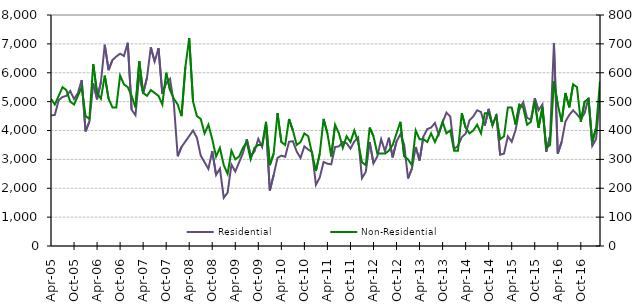
| Category | Residential |
|---|---|
| 2005-04-01 | 4520 |
| 2005-05-01 | 4540 |
| 2005-06-01 | 5050 |
| 2005-07-01 | 5160 |
| 2005-08-01 | 5200 |
| 2005-09-01 | 5370 |
| 2005-10-01 | 5090 |
| 2005-11-01 | 5290 |
| 2005-12-01 | 5750 |
| 2006-01-01 | 3970 |
| 2006-02-01 | 4310 |
| 2006-03-01 | 5630 |
| 2006-04-01 | 5080 |
| 2006-05-01 | 5680 |
| 2006-06-01 | 6970 |
| 2006-07-01 | 6090 |
| 2006-08-01 | 6440 |
| 2006-09-01 | 6560 |
| 2006-10-01 | 6660 |
| 2006-11-01 | 6580 |
| 2006-12-01 | 7040 |
| 2007-01-01 | 4720 |
| 2007-02-01 | 4530 |
| 2007-03-01 | 5940 |
| 2007-04-01 | 5280 |
| 2007-05-01 | 5830 |
| 2007-06-01 | 6880 |
| 2007-07-01 | 6390 |
| 2007-08-01 | 6850 |
| 2007-09-01 | 5270 |
| 2007-10-01 | 5660 |
| 2007-11-01 | 5790 |
| 2007-12-01 | 4940 |
| 2008-01-01 | 3110 |
| 2008-02-01 | 3430 |
| 2008-03-01 | 3620 |
| 2008-04-01 | 3810 |
| 2008-05-01 | 4000 |
| 2008-06-01 | 3750 |
| 2008-07-01 | 3130 |
| 2008-08-01 | 2900 |
| 2008-09-01 | 2670 |
| 2008-10-01 | 3290 |
| 2008-11-01 | 2460 |
| 2008-12-01 | 2680 |
| 2009-01-01 | 1670 |
| 2009-02-01 | 1850 |
| 2009-03-01 | 2820 |
| 2009-04-01 | 2580 |
| 2009-05-01 | 2900 |
| 2009-06-01 | 3220 |
| 2009-07-01 | 3700 |
| 2009-08-01 | 3130 |
| 2009-09-01 | 3270 |
| 2009-10-01 | 3710 |
| 2009-11-01 | 3430 |
| 2009-12-01 | 4210 |
| 2010-01-01 | 1920 |
| 2010-02-01 | 2460 |
| 2010-03-01 | 3050 |
| 2010-04-01 | 3130 |
| 2010-05-01 | 3090 |
| 2010-06-01 | 3610 |
| 2010-07-01 | 3630 |
| 2010-08-01 | 3270 |
| 2010-09-01 | 3050 |
| 2010-10-01 | 3450 |
| 2010-11-01 | 3340 |
| 2010-12-01 | 3260 |
| 2011-01-01 | 2120 |
| 2011-02-01 | 2370 |
| 2011-03-01 | 2910 |
| 2011-04-01 | 2850 |
| 2011-05-01 | 2830 |
| 2011-06-01 | 3430 |
| 2011-07-01 | 3450 |
| 2011-08-01 | 3600 |
| 2011-09-01 | 3560 |
| 2011-10-01 | 3370 |
| 2011-11-01 | 3620 |
| 2011-12-01 | 3760 |
| 2012-01-01 | 2350 |
| 2012-02-01 | 2570 |
| 2012-03-01 | 3600 |
| 2012-04-01 | 2860 |
| 2012-05-01 | 3100 |
| 2012-06-01 | 3700 |
| 2012-07-01 | 3280 |
| 2012-08-01 | 3750 |
| 2012-09-01 | 3070 |
| 2012-10-01 | 3620 |
| 2012-11-01 | 3870 |
| 2012-12-01 | 3510 |
| 2013-01-01 | 2340 |
| 2013-02-01 | 2680 |
| 2013-03-01 | 3430 |
| 2013-04-01 | 2960 |
| 2013-05-01 | 3790 |
| 2013-06-01 | 4050 |
| 2013-07-01 | 4100 |
| 2013-08-01 | 4260 |
| 2013-09-01 | 3860 |
| 2013-10-01 | 4280 |
| 2013-11-01 | 4620 |
| 2013-12-01 | 4480 |
| 2014-01-01 | 3350 |
| 2014-02-01 | 3470 |
| 2014-03-01 | 3770 |
| 2014-04-01 | 3890 |
| 2014-05-01 | 4350 |
| 2014-06-01 | 4490 |
| 2014-07-01 | 4700 |
| 2014-08-01 | 4640 |
| 2014-09-01 | 4170 |
| 2014-10-01 | 4750 |
| 2014-11-01 | 4170 |
| 2014-12-01 | 4560 |
| 2015-01-01 | 3160 |
| 2015-02-01 | 3200 |
| 2015-03-01 | 3800 |
| 2015-04-01 | 3610 |
| 2015-05-01 | 4010 |
| 2015-06-01 | 4720 |
| 2015-07-01 | 4980 |
| 2015-08-01 | 4440 |
| 2015-09-01 | 4370 |
| 2015-10-01 | 5120 |
| 2015-11-01 | 4700 |
| 2015-12-01 | 4900 |
| 2016-01-01 | 3260 |
| 2016-02-01 | 3810 |
| 2016-03-01 | 7020 |
| 2016-04-01 | 3200 |
| 2016-05-01 | 3600 |
| 2016-06-01 | 4310 |
| 2016-07-01 | 4540 |
| 2016-08-01 | 4700 |
| 2016-09-01 | 4560 |
| 2016-10-01 | 4400 |
| 2016-11-01 | 4600 |
| 2016-12-01 | 5130 |
| 2017-01-01 | 3470 |
| 2017-02-01 | 3710 |
| 2017-03-01 | 5240 |